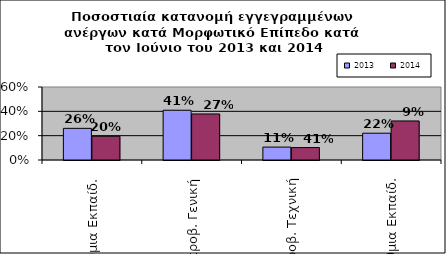
| Category | 2013 | 2014 |
|---|---|---|
| Πρωτοβάθμια Εκπαίδ. | 0.26 | 0.195 |
| Δευτεροβ. Γενική | 0.409 | 0.378 |
| Δευτεροβ. Τεχνική | 0.106 | 0.102 |
| Τριτοβάθμια Εκπαίδ. | 0.22 | 0.321 |